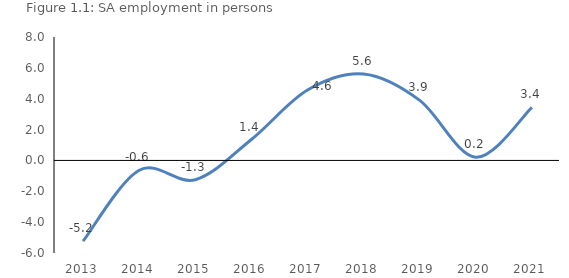
| Category | Employment SA (persons, Statistical Service) |
|---|---|
| 2013.0 | -5.23 |
| 2014.0 | -0.64 |
| 2015.0 | -1.251 |
| 2016.0 | 1.356 |
| 2017.0 | 4.562 |
| 2018.0 | 5.599 |
| 2019.0 | 3.891 |
| 2020.0 | 0.21 |
| 2021.0 | 3.441 |